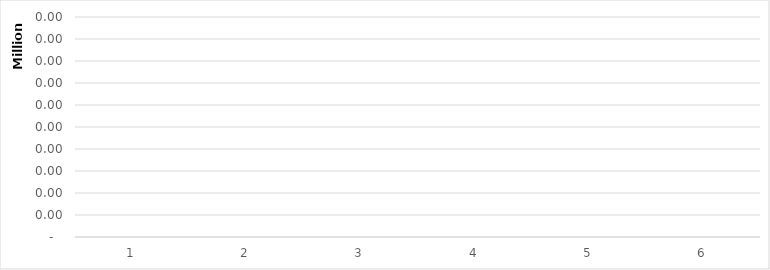
| Category | Series 0 |
|---|---|
| 0 | 311161.54 |
| 1 | 12129703.43 |
| 2 | 58296008.21 |
| 3 | 1671969712.94 |
| 4 | 524027399.32 |
| 5 | 64210553.4 |